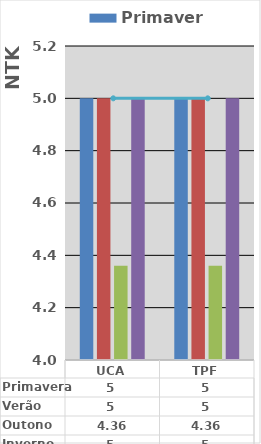
| Category | Primavera | Verão | Outono | Inverno |
|---|---|---|---|---|
| UCA | 5 | 5 | 4.36 | 5 |
| TPF | 5 | 5 | 4.36 | 5 |